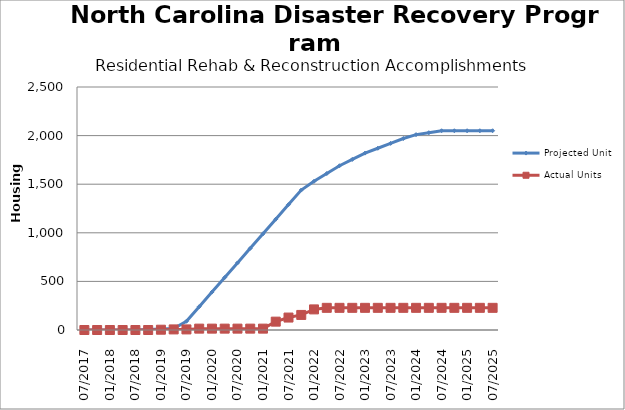
| Category | Projected Units | Actual Units |
|---|---|---|
| 07/2017 | 0 | 0 |
| 10/2017 | 0 | 0 |
| 01/2018 | 0 | 0 |
| 4/2018 | 0 | 0 |
| 07/2018 | 0 | 0 |
| 10/2018 | 5 | 0 |
| 01/2019 | 10 | 3 |
| 4/2019 | 15 | 6 |
| 07/2019 | 90 | 6 |
| 10/2019 | 240 | 14 |
| 01/2020 | 390 | 14 |
| 4/2020 | 540 | 14 |
| 07/2020 | 690 | 14 |
| 10/2020 | 840 | 14 |
| 01/2021 | 990 | 14 |
| 4/2021 | 1140 | 86 |
| 07/2021 | 1290 | 128 |
| 10/2021 | 1440 | 155 |
| 01/2022 | 1530 | 212 |
| 4/2022 | 1610 | 228 |
| 07/2022 | 1690 | 228 |
| 10/2022 | 1755 | 228 |
| 01/2023 | 1820 | 228 |
| 4/2023 | 1870 | 228 |
| 07/2023 | 1920 | 228 |
| 10/2023 | 1970 | 228 |
| 01/2024 | 2010 | 228 |
| 4/2024 | 2030 | 228 |
| 07/2024 | 2050 | 228 |
| 10/2024 | 2050 | 228 |
| 01/2025 | 2050 | 228 |
| 4/2025 | 2050 | 228 |
| 07/2025 | 2050 | 228 |